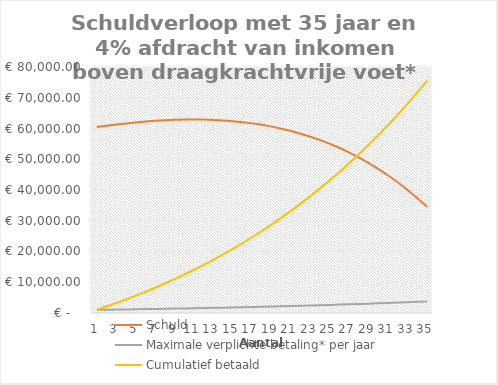
| Category | Schuld | Maximale verplichte betaling* per jaar | Cumulatief betaald |
|---|---|---|---|
| 0 | 60463.425 | 1036.575 | 1036.575 |
| 1 | 60895.044 | 1079.967 | 2116.542 |
| 2 | 61292.514 | 1124.906 | 3241.448 |
| 3 | 61653.383 | 1171.444 | 4412.892 |
| 4 | 61975.083 | 1219.634 | 5632.526 |
| 5 | 62254.93 | 1269.531 | 6902.057 |
| 6 | 62490.112 | 1321.191 | 8223.247 |
| 7 | 62677.694 | 1374.672 | 9597.919 |
| 8 | 62814.602 | 1430.034 | 11027.953 |
| 9 | 62897.627 | 1487.34 | 12515.292 |
| 10 | 62923.415 | 1546.653 | 14061.945 |
| 11 | 62888.462 | 1608.039 | 15669.984 |
| 12 | 62789.107 | 1671.566 | 17341.55 |
| 13 | 62621.53 | 1737.305 | 19078.855 |
| 14 | 62381.739 | 1805.328 | 20884.184 |
| 15 | 62065.573 | 1875.71 | 22759.894 |
| 16 | 61668.684 | 1948.528 | 24708.422 |
| 17 | 61186.54 | 2023.861 | 26732.283 |
| 18 | 60614.411 | 2101.792 | 28834.075 |
| 19 | 59947.366 | 2182.405 | 31016.48 |
| 20 | 59180.263 | 2265.788 | 33282.268 |
| 21 | 58307.74 | 2352.03 | 35634.298 |
| 22 | 57324.209 | 2441.225 | 38075.522 |
| 23 | 56223.846 | 2533.468 | 40608.99 |
| 24 | 55000.583 | 2628.859 | 43237.849 |
| 25 | 53648.099 | 2727.499 | 45965.348 |
| 26 | 52159.807 | 2829.494 | 48794.842 |
| 27 | 50528.85 | 2934.952 | 51729.795 |
| 28 | 48748.085 | 3043.986 | 54773.781 |
| 29 | 46810.077 | 3156.71 | 57930.491 |
| 30 | 44707.085 | 3273.244 | 61203.735 |
| 31 | 42431.052 | 3393.711 | 64597.445 |
| 32 | 39973.592 | 3518.237 | 68115.682 |
| 33 | 37325.979 | 3646.953 | 71762.635 |
| 34 | 34479.134 | 3779.994 | 75542.628 |